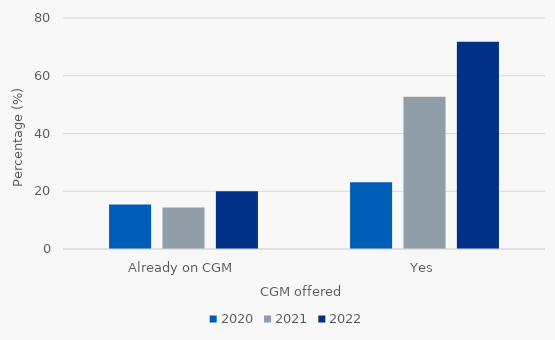
| Category | 2020 | 2021 | 2022 |
|---|---|---|---|
| Already on CGM | 15.385 | 14.36 | 20 |
| Yes | 23.077 | 52.742 | 71.807 |